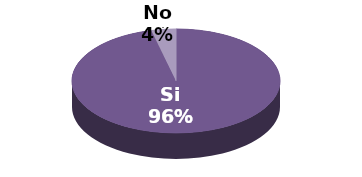
| Category | Series 1 |
|---|---|
| Si | 126 |
| No | 5 |